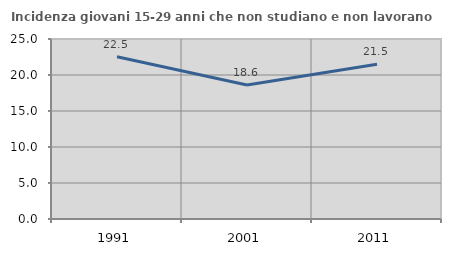
| Category | Incidenza giovani 15-29 anni che non studiano e non lavorano  |
|---|---|
| 1991.0 | 22.535 |
| 2001.0 | 18.605 |
| 2011.0 | 21.488 |